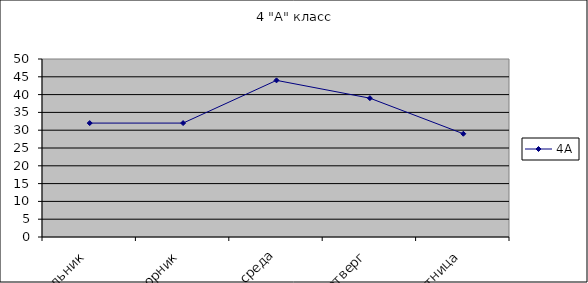
| Category | 4А |
|---|---|
| понедельник | 32 |
| вторник | 32 |
| среда | 44 |
| четверг | 39 |
| пятница | 29 |